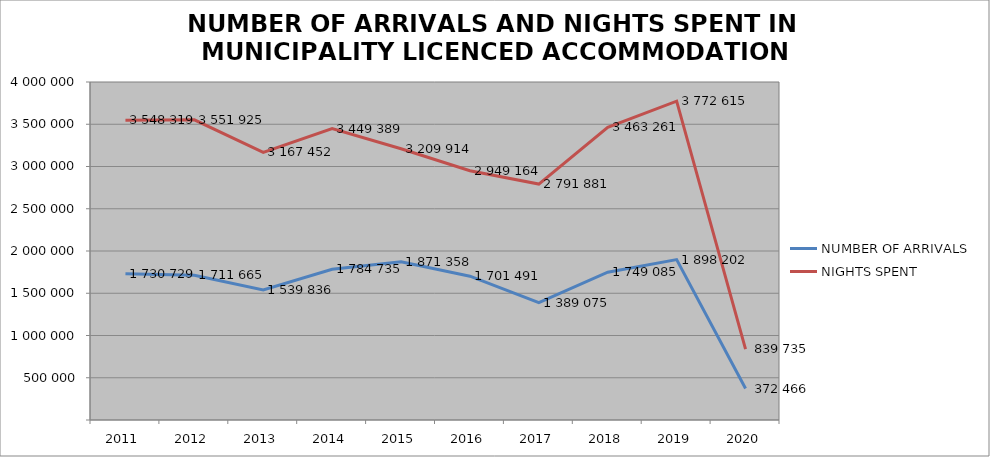
| Category | NUMBER OF ARRIVALS | NIGHTS SPENT |
|---|---|---|
| 2011 | 1730729 | 3548319 |
| 2012 | 1711665 | 3551925 |
| 2013 | 1539836 | 3167452 |
| 2014 | 1784735 | 3449389 |
| 2015 | 1871358 | 3209914 |
| 2016 | 1701491 | 2949164 |
| 2017 | 1389075 | 2791881 |
| 2018 | 1749085 | 3463261 |
| 2019 | 1898202 | 3772615 |
| 2020 | 372466 | 839735 |